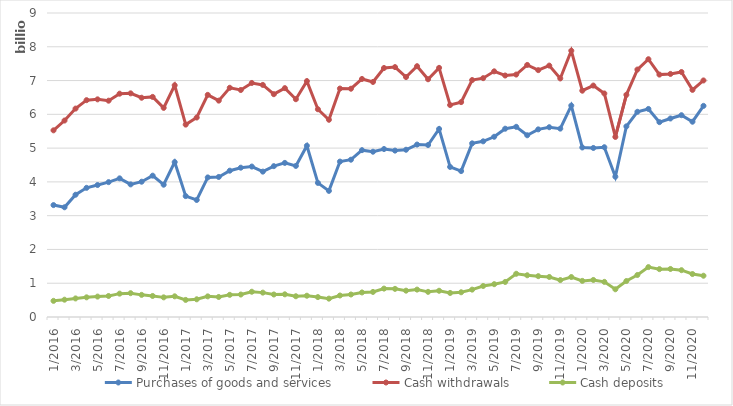
| Category | Purchases of goods and services | Cash withdrawals | Cash deposits |
|---|---|---|---|
| 1/2016 | 3313356181 | 5526440661 | 477949973 |
| 2/2016 | 3248269214 | 5816226861 | 512324963 |
| 3/2016 | 3619679238 | 6169984547 | 549662940 |
| 4/2016 | 3823999818 | 6419433107 | 582376393 |
| 5/2016 | 3907500543 | 6443747480 | 604150152 |
| 6/2016 | 3992803732 | 6404009850 | 622163959 |
| 7/2016 | 4104443392 | 6611263838 | 691690069 |
| 8/2016 | 3925959988 | 6621351165 | 705232805 |
| 9/2016 | 4005295393 | 6491524452 | 655447842 |
| 10/2016 | 4184310295 | 6516178632 | 622806180 |
| 11/2016 | 3916622974 | 6192076994 | 581315199 |
| 12/2016 | 4585676699 | 6860960168 | 612347745 |
| 1/2017 | 3579431859 | 5695813057 | 505971477 |
| 2/2017 | 3465062471 | 5905650526 | 524298023 |
| 3/2017 | 4132110078 | 6576518594 | 610672899 |
| 4/2017 | 4146194627 | 6405698115 | 593283764 |
| 5/2017 | 4331545466 | 6786132607 | 656245703 |
| 6/2017 | 4420401084 | 6720272792 | 665286210 |
| 7/2017 | 4454191914 | 6928847609 | 747986708 |
| 8/2017 | 4303812338 | 6870895799 | 721612254 |
| 9/2017 | 4466017428 | 6596491946 | 666343648 |
| 10/2017 | 4562095306 | 6775597691 | 671478223 |
| 11/2017 | 4472506453 | 6447912948 | 614247461 |
| 12/2017 | 5070421627 | 6983850032 | 629795691 |
| 1/2018 | 3970761857 | 6150362166 | 589626186 |
| 2/2018 | 3733864233 | 5839573308 | 543621541 |
| 3/2018 | 4601099257 | 6763550284 | 636323928 |
| 4/2018 | 4656855796 | 6758416318 | 666318190 |
| 5/2018 | 4939643042 | 7046946339 | 727001511 |
| 6/2018 | 4893590961 | 6958546377 | 742529375 |
| 7/2018 | 4972659540 | 7371645378 | 840639109 |
| 8/2018 | 4926174170 | 7398539225 | 833062337 |
| 9/2018 | 4951898400 | 7103767194 | 779834670 |
| 10/2018 | 5105376765 | 7425052401 | 811243501 |
| 11/2018 | 5091284082 | 7038340122 | 744465124 |
| 12/2018 | 5567481107 | 7376065076 | 776815255 |
| 1/2019 | 4442907364 | 6275899917 | 711926385 |
| 2/2019 | 4320140350 | 6362058436 | 732202511 |
| 3/2019 | 5140700342 | 7015376109 | 810345480 |
| 4/2019 | 5200880169 | 7071002942 | 918546770 |
| 5/2019 | 5335825539 | 7273046006 | 971493355 |
| 6/2019 | 5574421491 | 7149231768 | 1037709822 |
| 7/2019 | 5630367051 | 7178062210 | 1279840153 |
| 8/2019 | 5380446332 | 7462486991 | 1235675585 |
| 9/2019 | 5554968525 | 7308487837 | 1208971161 |
| 10/2019 | 5618367099 | 7443204522 | 1185647618 |
| 11/2019 | 5576230333 | 7062691220 | 1093097042 |
| 12/2019 | 6259150208 | 7883134692 | 1183230457 |
| 1/2020 | 5018727938 | 6699897228 | 1069343650 |
| 2/2020 | 5004372294 | 6851937184 | 1096436396 |
| 3/2020 | 5025958668 | 6617821862 | 1040121794 |
| 4/2020 | 4153664385 | 5330943234 | 820799905 |
| 5/2020 | 5643947112 | 6578274915 | 1065001388 |
| 6/2020 | 6075241804 | 7326012542 | 1243910150 |
| 7/2020 | 6159193196 | 7631600828 | 1477183426 |
| 8/2020 | 5768657876 | 7176491381 | 1417248104 |
| 9/2020 | 5876724832 | 7195986179 | 1421948483 |
| 10/2020 | 5974550525 | 7253249955 | 1386259219 |
| 11/2020 | 5781314069 | 6723548470 | 1272147177 |
| 12/2020 | 6250512362 | 7003078018 | 1221823167 |